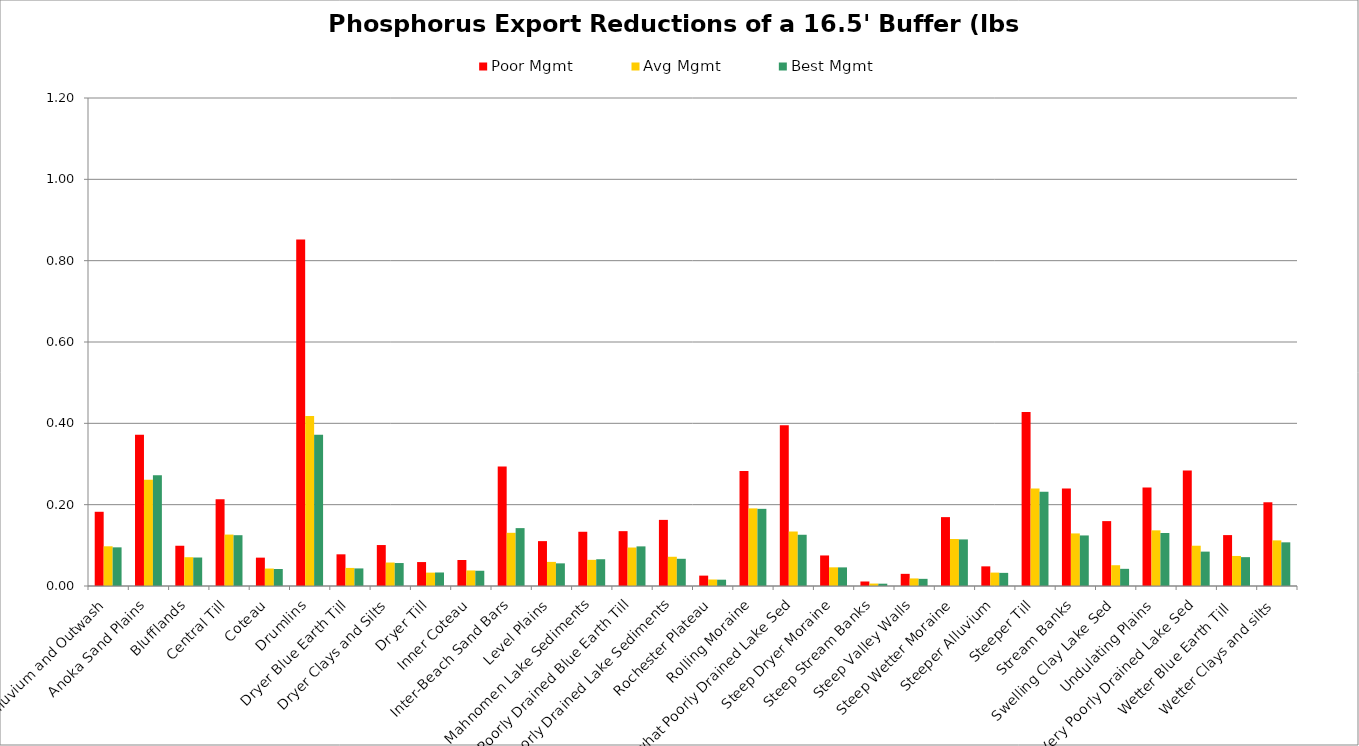
| Category | Poor Mgmt | Avg Mgmt | Best Mgmt |
|---|---|---|---|
| Alluvium and Outwash | 0.183 | 0.098 | 0.095 |
| Anoka Sand Plains | 0.372 | 0.261 | 0.272 |
| Blufflands | 0.099 | 0.071 | 0.07 |
| Central Till | 0.213 | 0.126 | 0.125 |
| Coteau | 0.07 | 0.043 | 0.042 |
| Drumlins | 0.852 | 0.418 | 0.372 |
| Dryer Blue Earth Till | 0.078 | 0.044 | 0.043 |
| Dryer Clays and Silts | 0.101 | 0.058 | 0.056 |
| Dryer Till | 0.059 | 0.033 | 0.033 |
| Inner Coteau | 0.064 | 0.038 | 0.037 |
| Inter-Beach Sand Bars | 0.294 | 0.131 | 0.142 |
| Level Plains | 0.11 | 0.059 | 0.056 |
| Mahnomen Lake Sediments | 0.133 | 0.064 | 0.066 |
| Poorly Drained Blue Earth Till | 0.135 | 0.095 | 0.097 |
| Poorly Drained Lake Sediments | 0.163 | 0.072 | 0.067 |
| Rochester Plateau | 0.026 | 0.016 | 0.015 |
| Rolling Moraine | 0.283 | 0.191 | 0.19 |
| Somewhat Poorly Drained Lake Sed | 0.395 | 0.134 | 0.126 |
| Steep Dryer Moraine | 0.075 | 0.046 | 0.046 |
| Steep Stream Banks | 0.011 | 0.006 | 0.006 |
| Steep Valley Walls | 0.03 | 0.019 | 0.018 |
| Steep Wetter Moraine | 0.169 | 0.116 | 0.115 |
| Steeper Alluvium | 0.048 | 0.033 | 0.032 |
| Steeper Till | 0.428 | 0.24 | 0.232 |
| Stream Banks | 0.24 | 0.129 | 0.124 |
| Swelling Clay Lake Sed | 0.16 | 0.051 | 0.042 |
| Undulating Plains | 0.242 | 0.137 | 0.13 |
| Very Poorly Drained Lake Sed | 0.284 | 0.099 | 0.085 |
| Wetter Blue Earth Till  | 0.125 | 0.074 | 0.071 |
| Wetter Clays and silts | 0.206 | 0.112 | 0.107 |